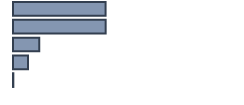
| Category | Series 0 |
|---|---|
| 0 | 40.783 |
| 1 | 40.817 |
| 2 | 11.614 |
| 3 | 6.639 |
| 4 | 0.147 |